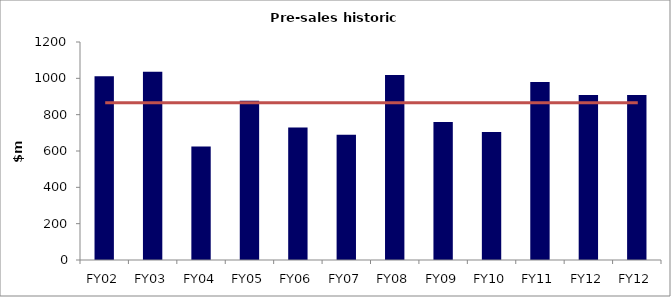
| Category | Series 0 |
|---|---|
| FY02 | 1011 |
| FY03 | 1036 |
| FY04 | 625 |
| FY05 | 877 |
| FY06 | 730 |
| FY07 | 689 |
| FY08 | 1018 |
| FY09 | 759 |
| FY10 | 704 |
| FY11 | 980.3 |
| FY12 | 907.7 |
| FY12 | 907.7 |